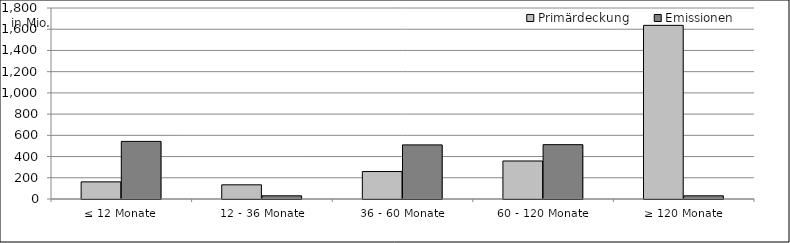
| Category | Primärdeckung | Emissionen |
|---|---|---|
| ≤ 12 Monate | 161530413.444 | 543000000 |
| 12 - 36 Monate | 133678639.268 | 30000000 |
| 36 - 60 Monate | 258764871.649 | 510000000 |
| 60 - 120 Monate | 358205818.49 | 512086000 |
| ≥ 120 Monate | 1636443067.072 | 30000000 |